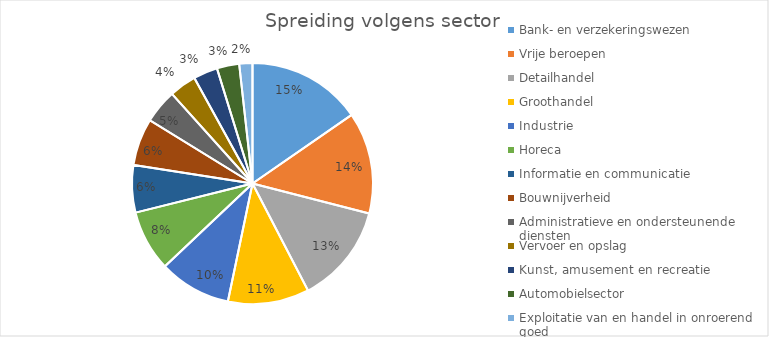
| Category | Q2 2017 |
|---|---|
| Bank- en verzekeringswezen | 94.597 |
| Vrije beroepen | 83.971 |
| Detailhandel | 82.352 |
| Groothandel | 67.083 |
| Industrie | 59.484 |
| Horeca | 50.32 |
| Informatie en communicatie | 39.059 |
| Bouwnijverheid | 38.976 |
| Administratieve en ondersteunende diensten | 28.036 |
| Vervoer en opslag | 22.403 |
| Kunst, amusement en recreatie | 20.041 |
| Automobielsector | 18.447 |
| Exploitatie van en handel in onroerend goed | 10.882 |